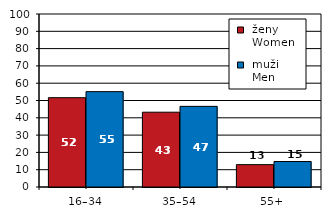
| Category |  ženy 
 Women |  muži 
 Men |
|---|---|---|
| 16–34 | 51.63 | 55.128 |
| 35–54 | 43.242 | 46.616 |
| 55+  | 12.929 | 14.724 |